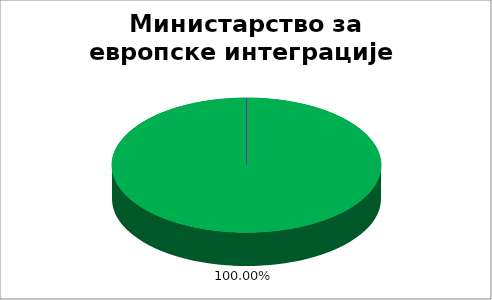
| Category | Министарство за европске интеграције  |
|---|---|
| 0 | 1 |
| 1 | 0 |
| 2 | 0 |
| 3 | 0 |
| 4 | 0 |